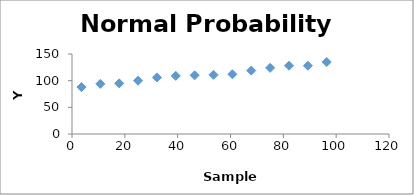
| Category | Series 0 |
|---|---|
| 3.5714285714285716 | 88 |
| 10.714285714285715 | 94 |
| 17.857142857142858 | 95 |
| 25.000000000000004 | 100 |
| 32.142857142857146 | 106 |
| 39.285714285714285 | 109 |
| 46.42857142857143 | 110 |
| 53.57142857142857 | 111 |
| 60.714285714285715 | 112 |
| 67.85714285714286 | 119 |
| 75.0 | 124 |
| 82.14285714285714 | 128 |
| 89.28571428571429 | 128 |
| 96.42857142857143 | 135 |